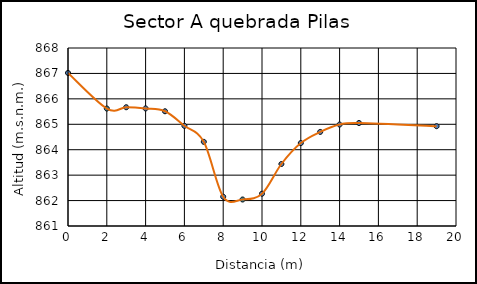
| Category | Series 0 |
|---|---|
| 0.0 | 867.02 |
| 2.0 | 865.62 |
| 3.0 | 865.67 |
| 4.0 | 865.624 |
| 5.0 | 865.512 |
| 6.0 | 864.94 |
| 7.0 | 864.31 |
| 8.0 | 862.151 |
| 9.0 | 862.042 |
| 10.0 | 862.27 |
| 11.0 | 863.438 |
| 12.0 | 864.261 |
| 13.0 | 864.7 |
| 14.0 | 864.99 |
| 15.0 | 865.05 |
| 19.0 | 864.925 |